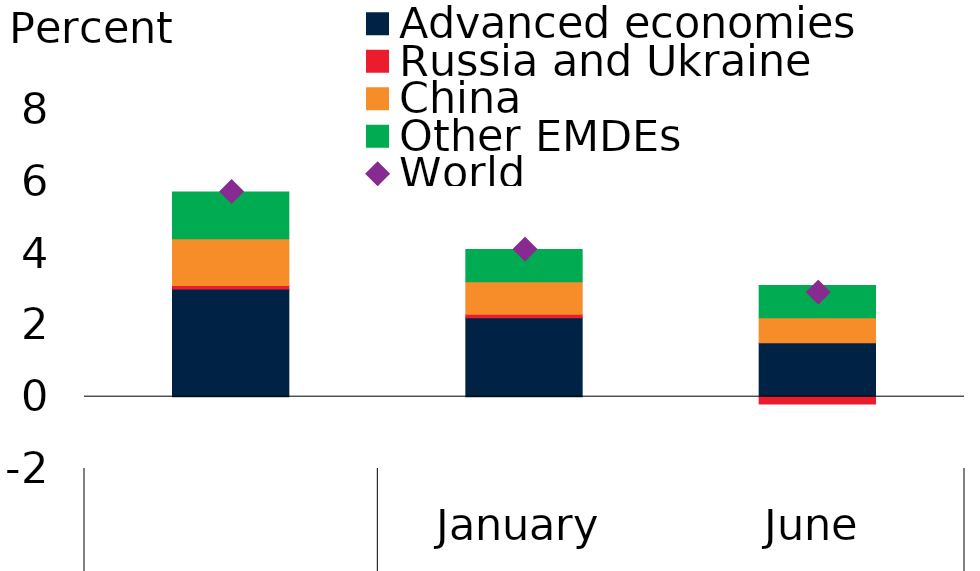
| Category | Advanced economies | Russia and Ukraine | China | Other EMDEs |
|---|---|---|---|---|
| 0 | 3 | 0.1 | 1.3 | 1.3 |
| 1 | 2.2 | 0.1 | 0.9 | 0.9 |
| 2 | 1.5 | -0.2 | 0.7 | 0.9 |